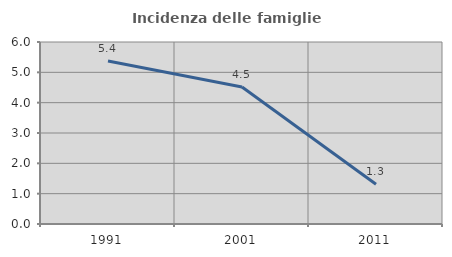
| Category | Incidenza delle famiglie numerose |
|---|---|
| 1991.0 | 5.371 |
| 2001.0 | 4.518 |
| 2011.0 | 1.31 |